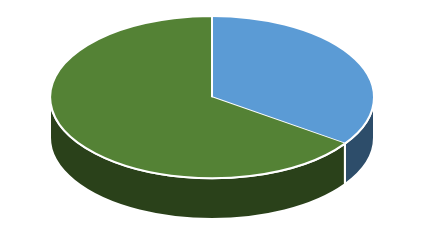
| Category | Series 0 |
|---|---|
| Sí | 0.347 |
| No | 0.653 |